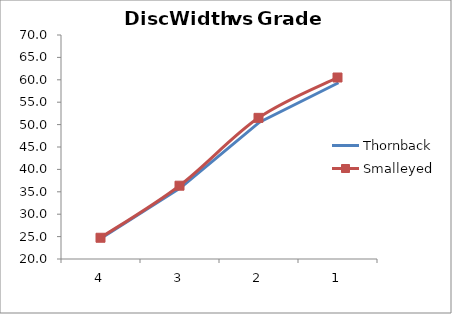
| Category | Thornback |
|---|---|
| 0 | 24.719 |
| 1 | 35.871 |
| 2 | 50.549 |
| 3 | 59.337 |